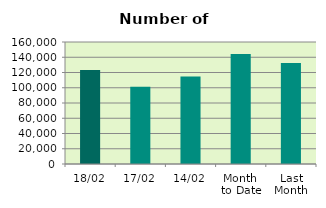
| Category | Series 0 |
|---|---|
| 18/02 | 123166 |
| 17/02 | 101218 |
| 14/02 | 114814 |
| Month 
to Date | 144315.5 |
| Last
Month | 132423.636 |